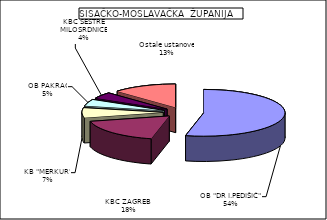
| Category | Series 0 |
|---|---|
| OB "DR I.PEDIŠIĆ" | 53.587 |
| KBC ZAGREB  | 17.702 |
| KB "MERKUR" | 6.907 |
| OB PAKRAC | 4.608 |
| KBC SESTRE MILOSRDNICE | 4.42 |
| Ostale ustanove | 12.775 |